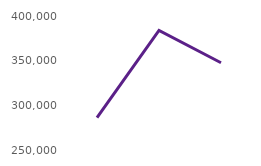
| Category | Users accessing the website |
|---|---|
| Dec23 | 286118 |
| Jan24 | 383956 |
| Feb24 | 347656 |